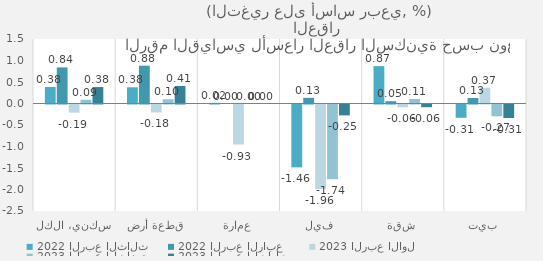
| Category | 2022 | 2023 |
|---|---|---|
| سكني، الكل | 0.839 | 0.383 |
| قطعة أرض | 0.879 | 0.408 |
| عمارة | 0 | 0 |
| فيلا | 0.132 | -0.253 |
| شقة | 0.053 | -0.063 |
| بيت | 0.128 | -0.315 |